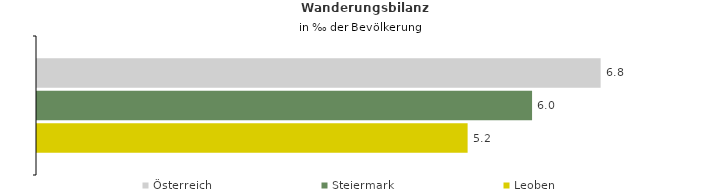
| Category | Österreich | Steiermark | Leoben |
|---|---|---|---|
| Wanderungsrate in ‰ der Bevölkerung, Periode 2018-2022 | 6.822 | 5.992 | 5.212 |